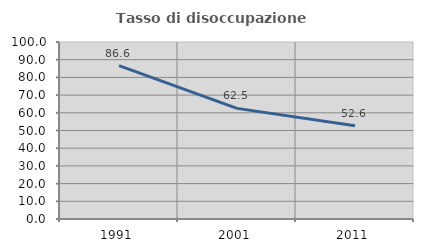
| Category | Tasso di disoccupazione giovanile  |
|---|---|
| 1991.0 | 86.607 |
| 2001.0 | 62.5 |
| 2011.0 | 52.632 |